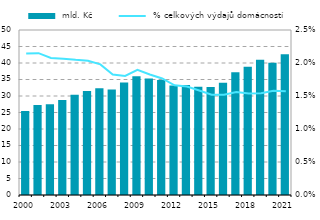
| Category |  mld. Kč |
|---|---|
| 2000.0 | 25.451 |
| 2001.0 | 27.243 |
| 2002.0 | 27.473 |
| 2003.0 | 28.797 |
| 2004.0 | 30.341 |
| 2005.0 | 31.532 |
| 2006.0 | 32.371 |
| 2007.0 | 31.994 |
| 2008.0 | 34.093 |
| 2009.0 | 35.989 |
| 2010.0 | 35.305 |
| 2011.0 | 34.868 |
| 2012.0 | 33.151 |
| 2013.0 | 33.324 |
| 2014.0 | 32.792 |
| 2015.0 | 32.698 |
| 2016.0 | 34.045 |
| 2017.0 | 37.17 |
| 2018.0 | 38.837 |
| 2019.0 | 41.015 |
| 2020.0 | 40.085 |
| 2021.0 | 42.672 |